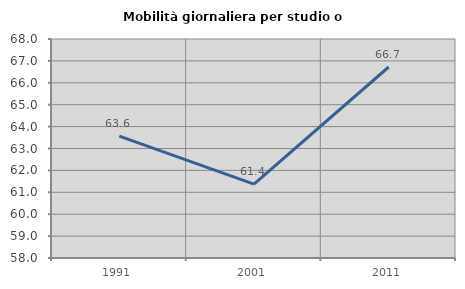
| Category | Mobilità giornaliera per studio o lavoro |
|---|---|
| 1991.0 | 63.566 |
| 2001.0 | 61.375 |
| 2011.0 | 66.721 |